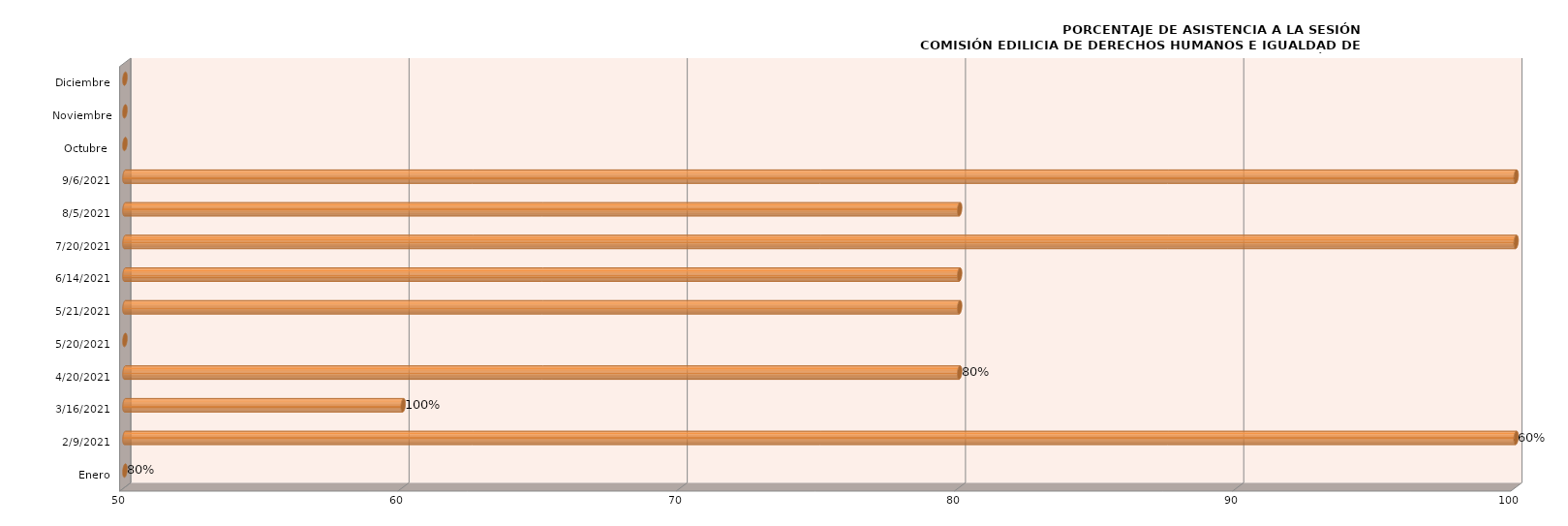
| Category | Series 0 |
|---|---|
| Enero | 0 |
| 09/02/2021 | 100 |
| 16/03/2021 | 60 |
| 20/04/2021 | 80 |
| 20/05/2021 | 0 |
| 21/05/2021 | 80 |
| 14/06/2021 | 80 |
| 20/07/2021 | 100 |
| 05/08/2021 | 80 |
| 06/09/2021 | 100 |
| Octubre  | 0 |
| Noviembre | 0 |
| Diciembre | 0 |